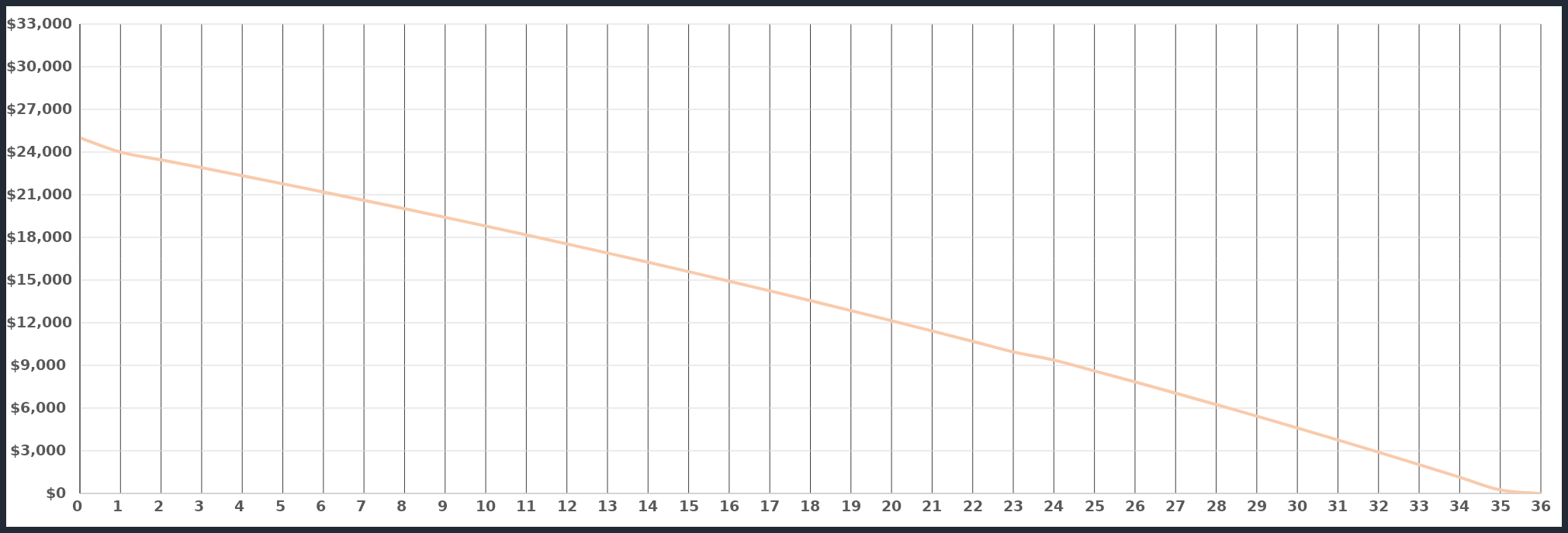
| Category | Debt Amount |
|---|---|
| 0.0 | 25000 |
| 1.0 | 23996 |
| 2.0 | 23452.379 |
| 3.0 | 22900.58 |
| 4.0 | 22340.466 |
| 5.0 | 21771.894 |
| 6.0 | 21194.719 |
| 7.0 | 20608.796 |
| 8.0 | 20013.974 |
| 9.0 | 19410.102 |
| 10.0 | 18797.023 |
| 11.0 | 18174.77 |
| 12.0 | 17543.261 |
| 13.0 | 16902.343 |
| 14.0 | 16251.86 |
| 15.0 | 15591.652 |
| 16.0 | 14921.572 |
| 17.0 | 14241.704 |
| 18.0 | 13551.89 |
| 19.0 | 12851.971 |
| 20.0 | 12141.782 |
| 21.0 | 11421.361 |
| 22.0 | 10690.782 |
| 23.0 | 9949.889 |
| 24.0 | 9377.662 |
| 25.0 | 8614.961 |
| 26.0 | 7839.286 |
| 27.0 | 7050.414 |
| 28.0 | 6248.121 |
| 29.0 | 5432.18 |
| 30.0 | 4602.357 |
| 31.0 | 3758.464 |
| 32.0 | 2900.609 |
| 33.0 | 2028.56 |
| 34.0 | 1142.081 |
| 35.0 | 241.652 |
| 36.0 | 0 |
| 37.0 | 0 |
| 38.0 | 0 |
| 39.0 | 0 |
| 40.0 | 0 |
| 41.0 | 0 |
| 42.0 | 0 |
| 43.0 | 0 |
| 44.0 | 0 |
| 45.0 | 0 |
| 46.0 | 0 |
| 47.0 | 0 |
| 48.0 | 0 |
| 49.0 | 0 |
| 50.0 | 0 |
| 51.0 | 0 |
| 52.0 | 0 |
| 53.0 | 0 |
| 54.0 | 0 |
| 55.0 | 0 |
| 56.0 | 0 |
| 57.0 | 0 |
| 58.0 | 0 |
| 59.0 | 0 |
| 60.0 | 0 |
| 61.0 | 0 |
| 62.0 | 0 |
| 63.0 | 0 |
| 64.0 | 0 |
| 65.0 | 0 |
| 66.0 | 0 |
| 67.0 | 0 |
| 68.0 | 0 |
| 69.0 | 0 |
| 70.0 | 0 |
| 71.0 | 0 |
| 72.0 | 0 |
| 73.0 | 0 |
| 74.0 | 0 |
| 75.0 | 0 |
| 76.0 | 0 |
| 77.0 | 0 |
| 78.0 | 0 |
| 79.0 | 0 |
| 80.0 | 0 |
| 81.0 | 0 |
| 82.0 | 0 |
| 83.0 | 0 |
| 84.0 | 0 |
| 85.0 | 0 |
| 86.0 | 0 |
| 87.0 | 0 |
| 88.0 | 0 |
| 89.0 | 0 |
| 90.0 | 0 |
| 91.0 | 0 |
| 92.0 | 0 |
| 93.0 | 0 |
| 94.0 | 0 |
| 95.0 | 0 |
| 96.0 | 0 |
| 97.0 | 0 |
| 98.0 | 0 |
| 99.0 | 0 |
| 100.0 | 0 |
| 101.0 | 0 |
| 102.0 | 0 |
| 103.0 | 0 |
| 104.0 | 0 |
| 105.0 | 0 |
| 106.0 | 0 |
| 107.0 | 0 |
| 108.0 | 0 |
| 109.0 | 0 |
| 110.0 | 0 |
| 111.0 | 0 |
| 112.0 | 0 |
| 113.0 | 0 |
| 114.0 | 0 |
| 115.0 | 0 |
| 116.0 | 0 |
| 117.0 | 0 |
| 118.0 | 0 |
| 119.0 | 0 |
| 120.0 | 0 |